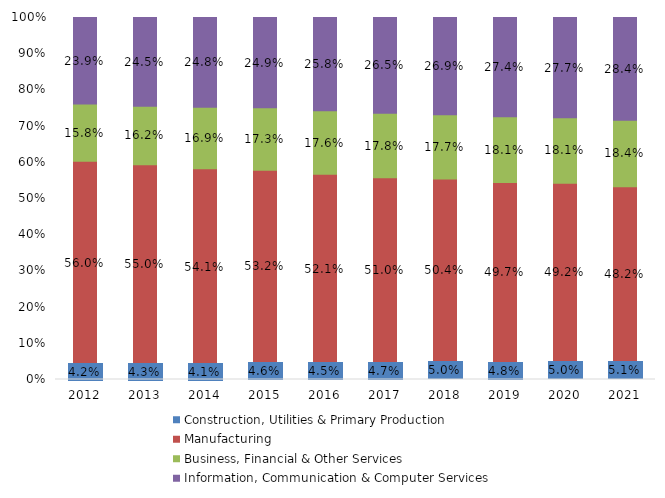
| Category | Construction, Utilities & Primary Production  | Manufacturing  | Business, Financial & Other Services | Information, Communication & Computer Services |
|---|---|---|---|---|
| 2012.0 | 0.042 | 0.56 | 0.158 | 0.239 |
| 2013.0 | 0.043 | 0.55 | 0.162 | 0.245 |
| 2014.0 | 0.041 | 0.541 | 0.169 | 0.248 |
| 2015.0 | 0.046 | 0.532 | 0.173 | 0.249 |
| 2016.0 | 0.045 | 0.521 | 0.176 | 0.258 |
| 2017.0 | 0.047 | 0.51 | 0.178 | 0.265 |
| 2018.0 | 0.05 | 0.504 | 0.177 | 0.269 |
| 2019.0 | 0.048 | 0.497 | 0.181 | 0.274 |
| 2020.0 | 0.05 | 0.492 | 0.181 | 0.277 |
| 2021.0 | 0.051 | 0.482 | 0.184 | 0.284 |